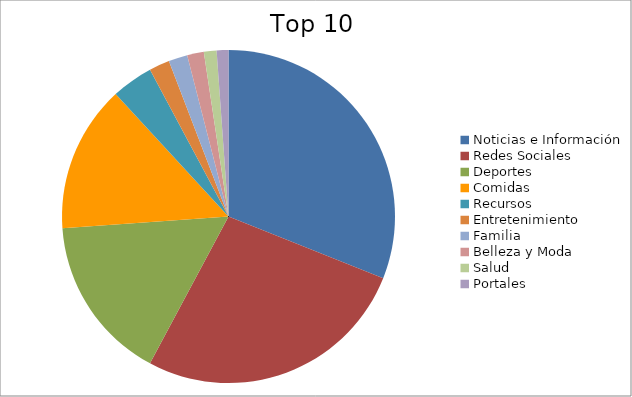
| Category | Series 0 |
|---|---|
| Noticias e Información | 30.47 |
| Redes Sociales | 26.29 |
| Deportes | 15.77 |
| Comidas | 14.01 |
| Recursos | 3.97 |
| Entretenimiento | 1.95 |
| Familia | 1.8 |
| Belleza y Moda | 1.59 |
| Salud | 1.21 |
| Portales | 1.12 |